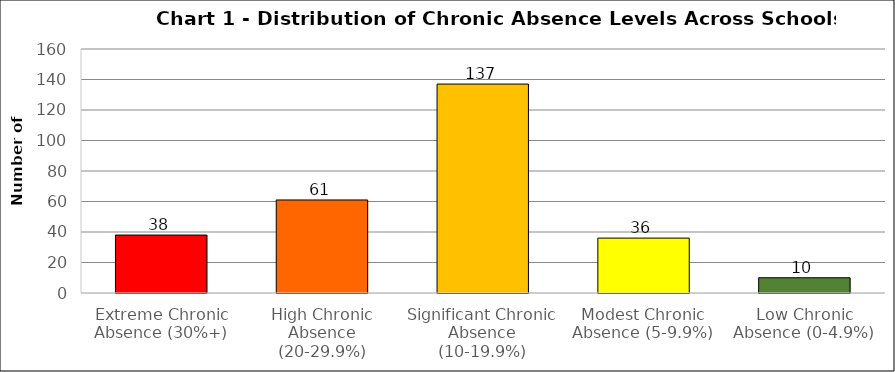
| Category | Series 0 |
|---|---|
| Extreme Chronic Absence (30%+) | 38 |
| High Chronic Absence (20-29.9%) | 61 |
| Significant Chronic Absence (10-19.9%) | 137 |
| Modest Chronic Absence (5-9.9%) | 36 |
| Low Chronic Absence (0-4.9%) | 10 |